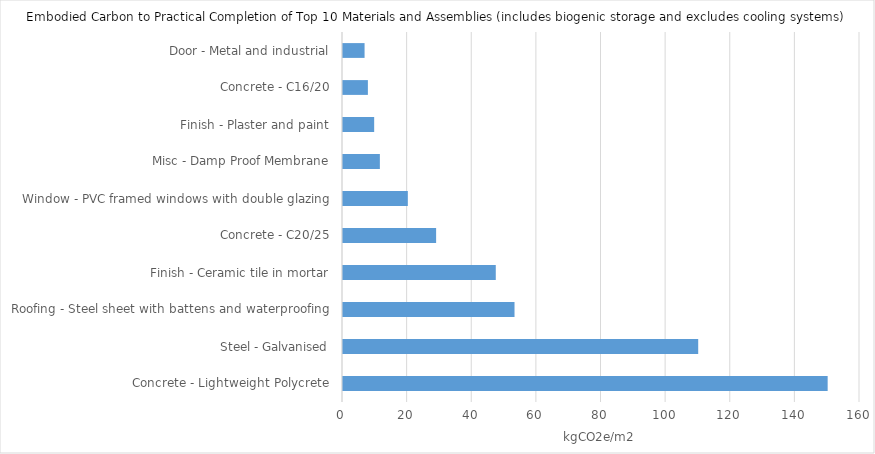
| Category | A |
|---|---|
| Concrete - Lightweight Polycrete | 150.301 |
| Steel - Galvanised | 110.238 |
| Roofing - Steel sheet with battens and waterproofing | 53.39 |
| Finish - Ceramic tile in mortar | 47.591 |
| Concrete - C20/25 | 29.128 |
| Window - PVC framed windows with double glazing | 20.371 |
| Misc - Damp Proof Membrane | 11.72 |
| Finish - Plaster and paint | 9.956 |
| Concrete - C16/20 | 8.01 |
| Door - Metal and industrial | 6.984 |